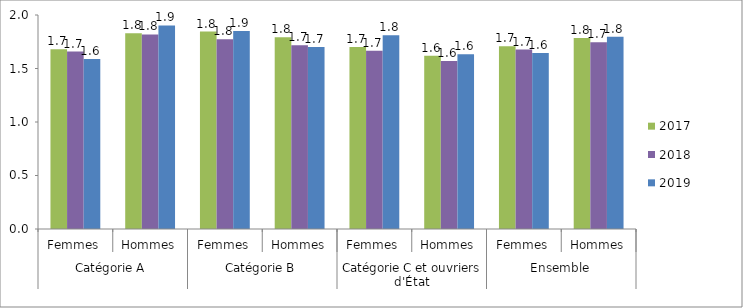
| Category | 2017 | 2018 | 2019 |
|---|---|---|---|
| 0 | 1.679 | 1.659 | 1.588 |
| 1 | 1.829 | 1.818 | 1.902 |
| 2 | 1.845 | 1.774 | 1.85 |
| 3 | 1.791 | 1.716 | 1.702 |
| 4 | 1.701 | 1.666 | 1.811 |
| 5 | 1.62 | 1.571 | 1.633 |
| 6 | 1.707 | 1.677 | 1.645 |
| 7 | 1.784 | 1.745 | 1.796 |